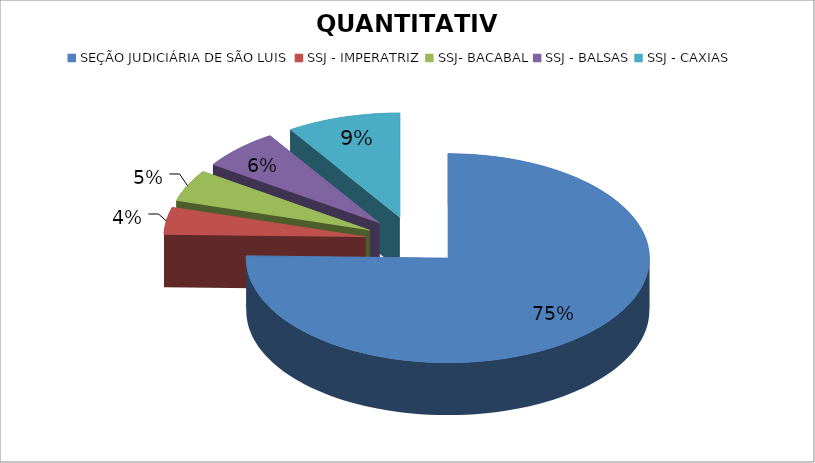
| Category | QUANTITATIVO |
|---|---|
| SEÇÃO JUDICIÁRIA DE SÃO LUIS | 107 |
| SSJ - IMPERATRIZ | 6 |
| SSJ- BACABAL | 7 |
| SSJ - BALSAS | 9 |
| SSJ - CAXIAS | 13 |